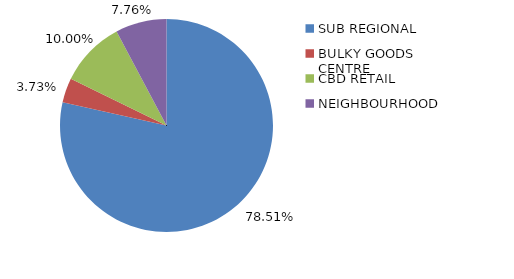
| Category | Series 0 |
|---|---|
| SUB REGIONAL | 0.785 |
| BULKY GOODS CENTRE | 0.037 |
| CBD RETAIL | 0.1 |
| NEIGHBOURHOOD | 0.078 |